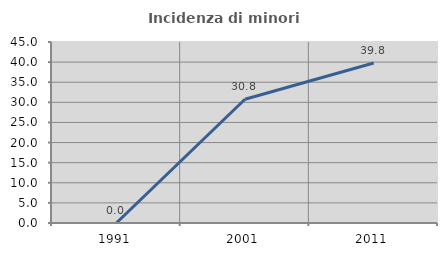
| Category | Incidenza di minori stranieri |
|---|---|
| 1991.0 | 0 |
| 2001.0 | 30.769 |
| 2011.0 | 39.791 |